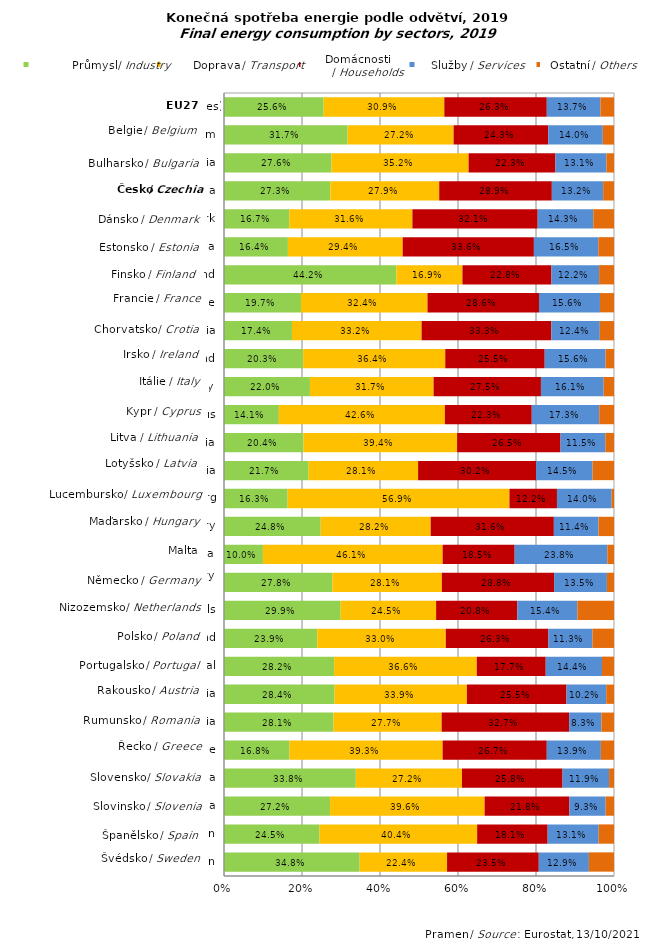
| Category | Průmysl / Industry | Doprava / Transport | Domácnosti /  | Služby / Services | ostatní / Others |
|---|---|---|---|---|---|
| Sweden | 0.348 | 0.224 | 0.235 | 0.129 | 0.064 |
| Spain | 0.245 | 0.404 | 0.181 | 0.131 | 0.039 |
| Slovenia | 0.272 | 0.396 | 0.218 | 0.093 | 0.022 |
| Slovakia | 0.338 | 0.272 | 0.258 | 0.119 | 0.013 |
| Greece | 0.168 | 0.393 | 0.267 | 0.139 | 0.034 |
| Romania | 0.281 | 0.277 | 0.327 | 0.083 | 0.032 |
| Austria | 0.284 | 0.339 | 0.255 | 0.102 | 0.02 |
| Portugal | 0.282 | 0.366 | 0.177 | 0.144 | 0.031 |
| Poland | 0.239 | 0.33 | 0.263 | 0.113 | 0.055 |
| Netherlands | 0.299 | 0.245 | 0.208 | 0.154 | 0.094 |
| Germany (until 1990 former territory of the FRG) | 0.278 | 0.281 | 0.288 | 0.135 | 0.018 |
| Malta | 0.1 | 0.461 | 0.185 | 0.238 | 0.017 |
| Hungary | 0.248 | 0.282 | 0.316 | 0.114 | 0.04 |
| Luxembourg | 0.163 | 0.569 | 0.122 | 0.14 | 0.006 |
| Latvia | 0.217 | 0.281 | 0.302 | 0.145 | 0.055 |
| Lithuania | 0.204 | 0.394 | 0.265 | 0.115 | 0.022 |
| Cyprus | 0.141 | 0.426 | 0.223 | 0.173 | 0.038 |
| Italy | 0.22 | 0.317 | 0.275 | 0.161 | 0.027 |
| Ireland | 0.203 | 0.364 | 0.255 | 0.156 | 0.022 |
| Croatia | 0.174 | 0.332 | 0.333 | 0.124 | 0.036 |
| France | 0.197 | 0.324 | 0.286 | 0.156 | 0.036 |
| Finland | 0.442 | 0.169 | 0.228 | 0.122 | 0.038 |
| Estonia | 0.164 | 0.294 | 0.336 | 0.165 | 0.04 |
| Denmark | 0.167 | 0.316 | 0.321 | 0.143 | 0.053 |
| Czechia | 0.273 | 0.279 | 0.289 | 0.132 | 0.028 |
| Bulgaria | 0.276 | 0.352 | 0.223 | 0.131 | 0.019 |
| Belgium | 0.317 | 0.272 | 0.243 | 0.14 | 0.029 |
| European Union (27 countries) | 0.256 | 0.309 | 0.263 | 0.137 | 0.035 |